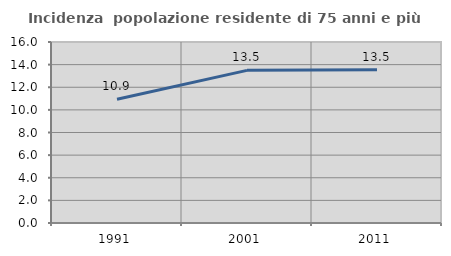
| Category | Incidenza  popolazione residente di 75 anni e più |
|---|---|
| 1991.0 | 10.934 |
| 2001.0 | 13.493 |
| 2011.0 | 13.542 |